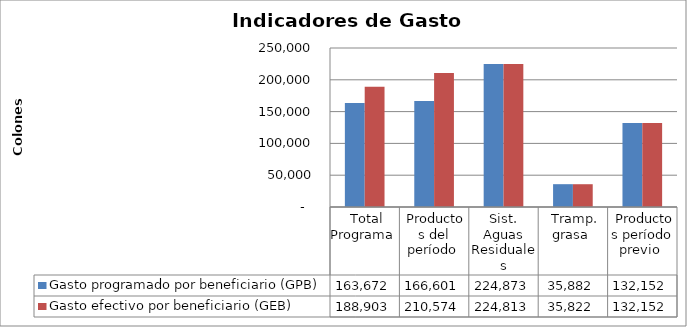
| Category | Gasto programado por beneficiario (GPB)  | Gasto efectivo por beneficiario (GEB)  |
|---|---|---|
| Total Programa | 163671.956 | 188903.439 |
| Productos del período | 166600.644 | 210573.767 |
| Sist. Aguas Residuales | 224872.81 | 224812.8 |
| Tramp. grasa | 35882 | 35822 |
| Productos período previo | 132152.446 | 132152.446 |